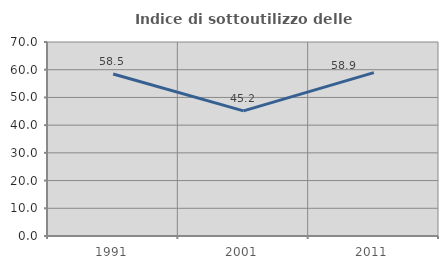
| Category | Indice di sottoutilizzo delle abitazioni  |
|---|---|
| 1991.0 | 58.462 |
| 2001.0 | 45.161 |
| 2011.0 | 58.929 |